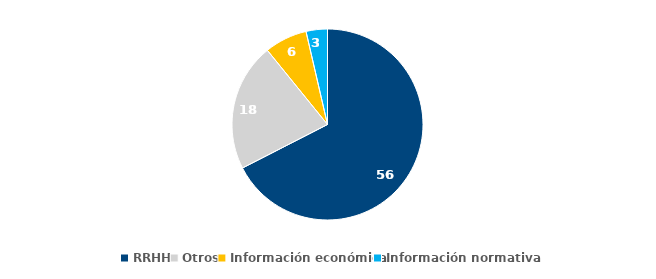
| Category | 2020 |
|---|---|
| RRHH | 56 |
| Otros | 18 |
| Información económica | 6 |
| Información normativa | 3 |